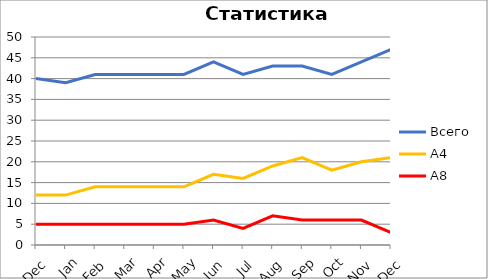
| Category | Всего | А4 | A8 |
|---|---|---|---|
| 0 | 40 | 12 | 5 |
| 1 | 39 | 12 | 5 |
| 2 | 41 | 14 | 5 |
| 3 | 41 | 14 | 5 |
| 4 | 41 | 14 | 5 |
| 5 | 41 | 14 | 5 |
| 6 | 44 | 17 | 6 |
| 7 | 41 | 16 | 4 |
| 8 | 43 | 19 | 7 |
| 9 | 43 | 21 | 6 |
| 10 | 41 | 18 | 6 |
| 11 | 44 | 20 | 6 |
| 12 | 47 | 21 | 3 |